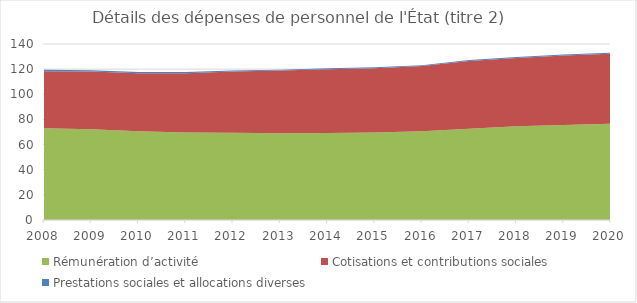
| Category | Rémunération d’activité | Cotisations et contributions sociales | Prestations sociales et allocations diverses |
|---|---|---|---|
| 2008.0 | 73.076 | 45.218 | 1.286 |
| 2009.0 | 72.16 | 46.056 | 0.995 |
| 2010.0 | 70.502 | 46.297 | 1.008 |
| 2011.0 | 69.607 | 47.104 | 0.998 |
| 2012.0 | 69.469 | 48.721 | 0.755 |
| 2013.0 | 69.049 | 49.777 | 0.77 |
| 2014.0 | 69.266 | 50.741 | 0.758 |
| 2015.0 | 69.579 | 51.231 | 0.76 |
| 2016.0 | 70.589 | 51.867 | 0.734 |
| 2017.0 | 72.612 | 53.885 | 0.715 |
| 2018.0 | 74.48 | 54.418 | 0.728 |
| 2019.0 | 75.661 | 55.172 | 0.748 |
| 2020.0 | 76.489 | 55.749 | 0.759 |